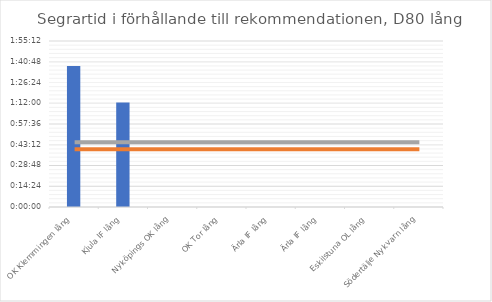
| Category | D80 tid |
|---|---|
| OK Klemmingen lång | 0.068 |
| Kjula IF lång | 0.05 |
| Nyköpings OK lång | 0 |
| OK Tor lång | 0 |
| Ärla IF lång | 0 |
| Ärla IF lång | 0 |
| Eskilstuna OL lång | 0 |
| Södertälje Nykvarn lång | 0 |